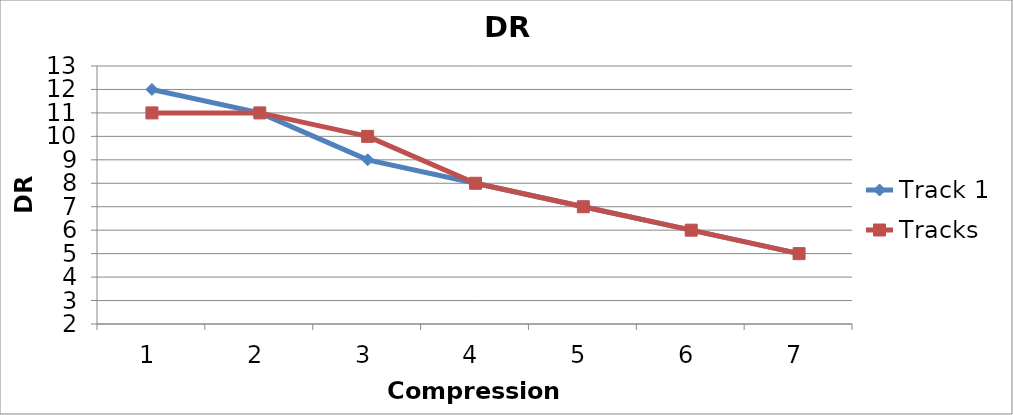
| Category | Track 1 | Tracks |
|---|---|---|
| 0 | 12 | 11 |
| 1 | 11 | 11 |
| 2 | 9 | 10 |
| 3 | 8 | 8 |
| 4 | 7 | 7 |
| 5 | 6 | 6 |
| 6 | 5 | 5 |